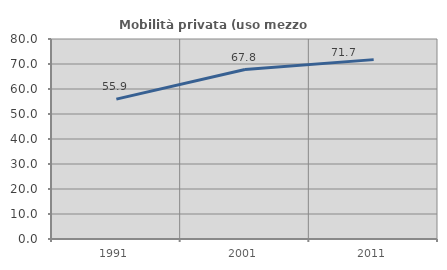
| Category | Mobilità privata (uso mezzo privato) |
|---|---|
| 1991.0 | 55.941 |
| 2001.0 | 67.769 |
| 2011.0 | 71.748 |